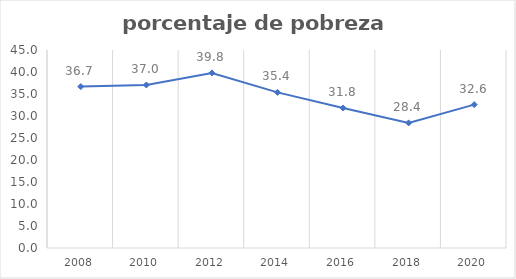
| Category | Series 0 |
|---|---|
| 2008.0 | 36.693 |
| 2010.0 | 37.05 |
| 2012.0 | 39.789 |
| 2014.0 | 35.368 |
| 2016.0 | 31.814 |
| 2018.0 | 28.429 |
| 2020.0 | 32.588 |